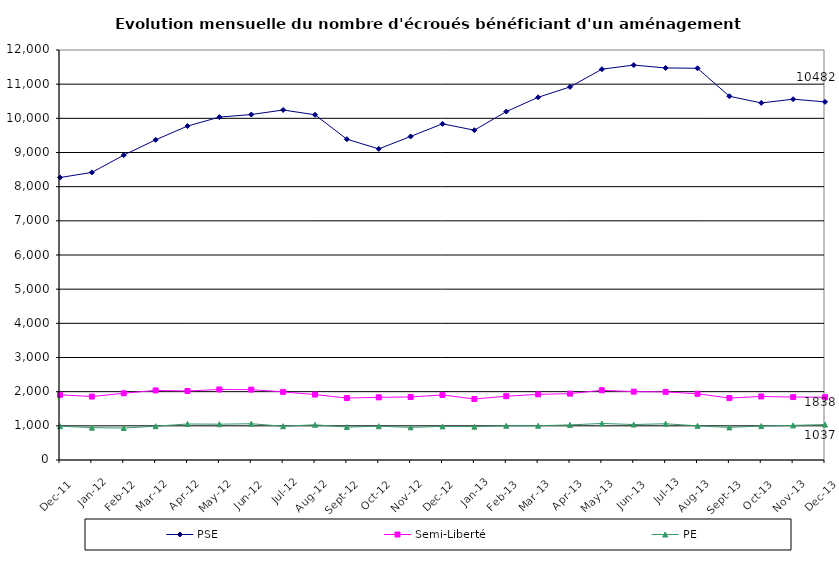
| Category | PSE | Semi-Liberté | PE |
|---|---|---|---|
| 2011-12-01 | 8267 | 1908 | 989 |
| 2012-01-01 | 8417 | 1857 | 947 |
| 2012-02-01 | 8924 | 1954 | 936 |
| 2012-03-01 | 9370 | 2036 | 989 |
| 2012-04-01 | 9774 | 2020 | 1054 |
| 2012-05-01 | 10036 | 2064 | 1048 |
| 2012-06-01 | 10111 | 2060 | 1061 |
| 2012-07-01 | 10244 | 1993 | 989 |
| 2012-08-01 | 10104 | 1916 | 1030 |
| 2012-09-01 | 9390 | 1813 | 964 |
| 2012-10-01 | 9105 | 1834 | 988 |
| 2012-11-01 | 9470 | 1845 | 955 |
| 2012-12-01 | 9840 | 1903 | 984 |
| 2013-01-01 | 9653 | 1785 | 976 |
| 2013-02-01 | 10197 | 1867 | 1002 |
| 2013-03-01 | 10615 | 1921 | 1002 |
| 2013-04-01 | 10919 | 1942 | 1027 |
| 2013-05-01 | 11438 | 2041 | 1070 |
| 2013-06-01 | 11559 | 2000 | 1038 |
| 2013-07-01 | 11475 | 1993 | 1061 |
| 2013-08-01 | 11465 | 1939 | 999 |
| 2013-09-01 | 10646 | 1813 | 954 |
| 2013-10-01 | 10451 | 1860 | 993 |
| 2013-11-01 | 10560 | 1842 | 1013 |
| 2013-12-01 | 10482 | 1838 | 1037 |